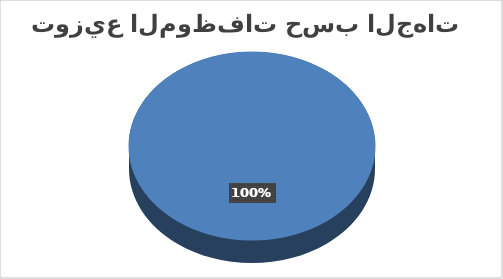
| Category | مصالح مركزية | جهة العيون – الساقية الحمراء |
|---|---|---|
| إناث | 80 | 9 |